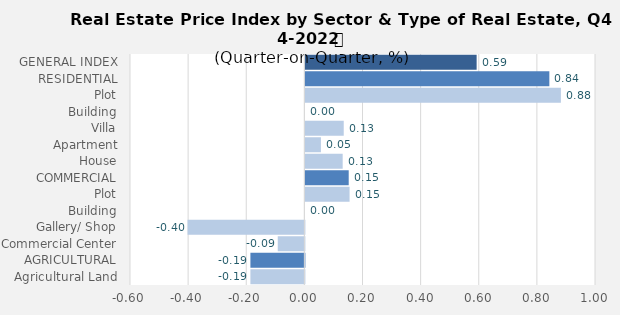
| Category | Q3-2022 |
|---|---|
| GENERAL INDEX | 0.589 |
| RESIDENTIAL | 0.839 |
| Plot | 0.879 |
| Building | 0 |
| Villa | 0.132 |
| Apartment | 0.053 |
| House | 0.128 |
| COMMERCIAL | 0.149 |
| Plot | 0.152 |
| Building | 0 |
| Gallery/ Shop | -0.402 |
| Commercial Center | -0.092 |
| AGRICULTURAL | -0.186 |
| Agricultural Land | -0.186 |